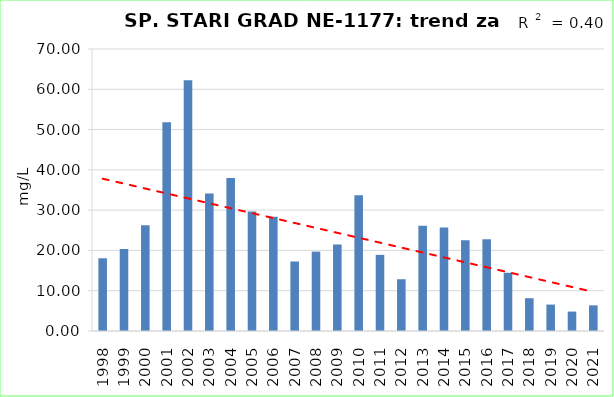
| Category | Vsota |
|---|---|
| 1998 | 18.05 |
| 1999 | 20.35 |
| 2000 | 26.25 |
| 2001 | 51.8 |
| 2002 | 62.25 |
| 2003 | 34.15 |
| 2004 | 38 |
| 2005 | 29.65 |
| 2006 | 28.35 |
| 2007 | 17.25 |
| 2008 | 19.7 |
| 2009 | 21.45 |
| 2010 | 33.7 |
| 2011 | 18.9 |
| 2012 | 12.85 |
| 2013 | 26.15 |
| 2014 | 25.7 |
| 2015 | 22.5 |
| 2016 | 22.8 |
| 2017 | 14.45 |
| 2018 | 8.14 |
| 2019 | 6.56 |
| 2020 | 4.82 |
| 2021 | 6.365 |